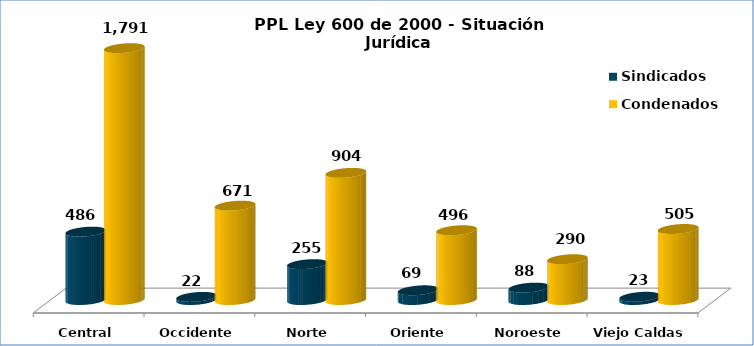
| Category | Sindicados | Condenados |
|---|---|---|
| Central | 486 | 1791 |
| Occidente | 22 | 671 |
| Norte | 255 | 904 |
| Oriente | 69 | 496 |
| Noroeste | 88 | 290 |
| Viejo Caldas | 23 | 505 |